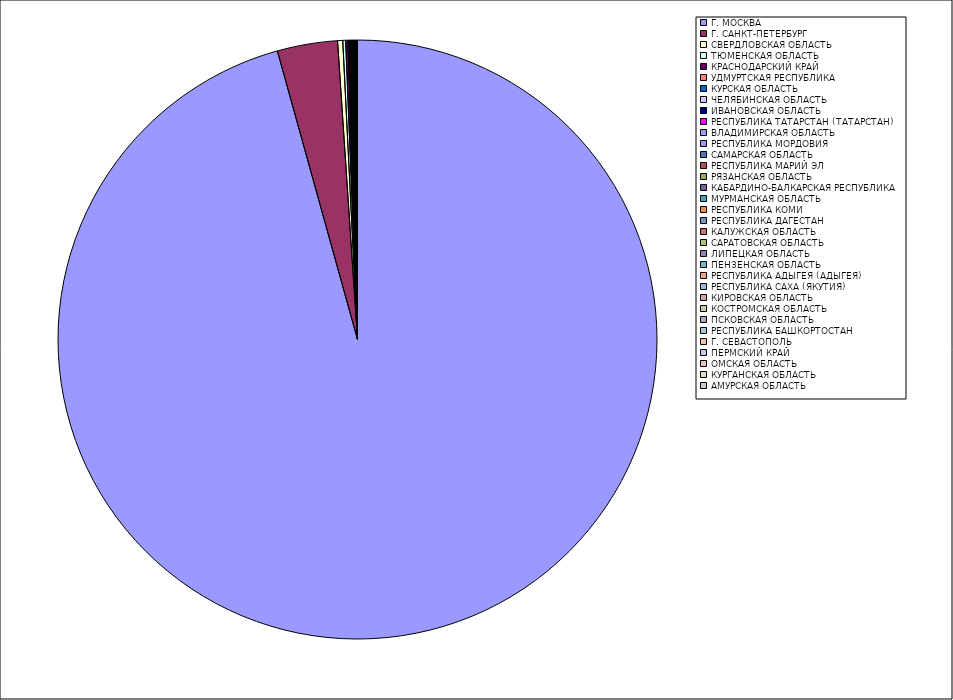
| Category | Оборот |
|---|---|
| Г. МОСКВА | 95.644 |
| Г. САНКТ-ПЕТЕРБУРГ | 3.249 |
| СВЕРДЛОВСКАЯ ОБЛАСТЬ | 0.277 |
| ТЮМЕНСКАЯ ОБЛАСТЬ | 0.154 |
| КРАСНОДАРСКИЙ КРАЙ | 0.122 |
| УДМУРТСКАЯ РЕСПУБЛИКА | 0.046 |
| КУРСКАЯ ОБЛАСТЬ | 0.041 |
| ЧЕЛЯБИНСКАЯ ОБЛАСТЬ | 0.033 |
| ИВАНОВСКАЯ ОБЛАСТЬ | 0.032 |
| РЕСПУБЛИКА ТАТАРСТАН (ТАТАРСТАН) | 0.031 |
| ВЛАДИМИРСКАЯ ОБЛАСТЬ | 0.029 |
| РЕСПУБЛИКА МОРДОВИЯ | 0.024 |
| САМАРСКАЯ ОБЛАСТЬ | 0.022 |
| РЕСПУБЛИКА МАРИЙ ЭЛ | 0.019 |
| РЯЗАНСКАЯ ОБЛАСТЬ | 0.019 |
| КАБАРДИНО-БАЛКАРСКАЯ РЕСПУБЛИКА | 0.019 |
| МУРМАНСКАЯ ОБЛАСТЬ | 0.015 |
| РЕСПУБЛИКА КОМИ | 0.015 |
| РЕСПУБЛИКА ДАГЕСТАН | 0.015 |
| КАЛУЖСКАЯ ОБЛАСТЬ | 0.015 |
| САРАТОВСКАЯ ОБЛАСТЬ | 0.015 |
| ЛИПЕЦКАЯ ОБЛАСТЬ | 0.014 |
| ПЕНЗЕНСКАЯ ОБЛАСТЬ | 0.014 |
| РЕСПУБЛИКА АДЫГЕЯ (АДЫГЕЯ) | 0.011 |
| РЕСПУБЛИКА САХА (ЯКУТИЯ) | 0.01 |
| КИРОВСКАЯ ОБЛАСТЬ | 0.009 |
| КОСТРОМСКАЯ ОБЛАСТЬ | 0.009 |
| ПСКОВСКАЯ ОБЛАСТЬ | 0.009 |
| РЕСПУБЛИКА БАШКОРТОСТАН | 0.008 |
| Г. СЕВАСТОПОЛЬ | 0.008 |
| ПЕРМСКИЙ КРАЙ | 0.008 |
| ОМСКАЯ ОБЛАСТЬ | 0.008 |
| КУРГАНСКАЯ ОБЛАСТЬ | 0.005 |
| АМУРСКАЯ ОБЛАСТЬ | 0.005 |